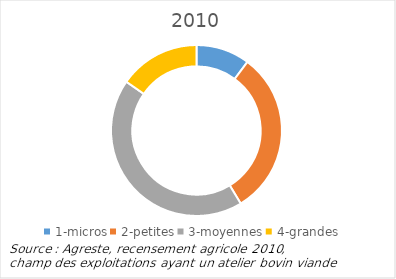
| Category | 2010 |
|---|---|
| 1-micros | 450 |
| 2-petites | 1381 |
| 3-moyennes | 1919 |
| 4-grandes | 679 |